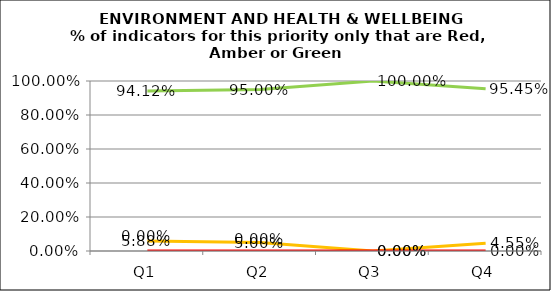
| Category | Green | Amber | Red |
|---|---|---|---|
| Q1 | 0.941 | 0.059 | 0 |
| Q2 | 0.95 | 0.05 | 0 |
| Q3 | 1 | 0 | 0 |
| Q4 | 0.955 | 0.045 | 0 |